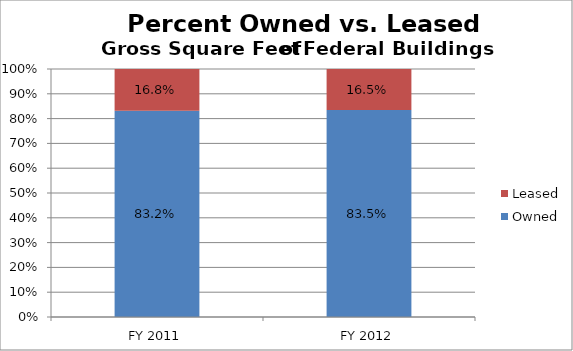
| Category | Owned | Leased |
|---|---|---|
| FY 2011 | 0.832 | 0.168 |
| FY 2012 | 0.835 | 0.165 |